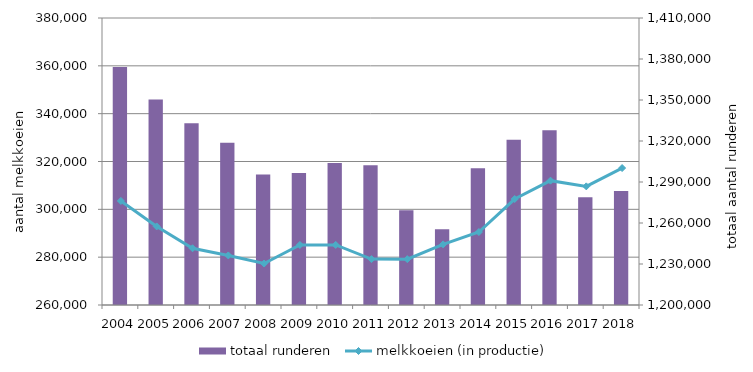
| Category | totaal runderen |
|---|---|
| 2004.0 | 1374090 |
| 2005.0 | 1350304 |
| 2006.0 | 1332923 |
| 2007.0 | 1318654 |
| 2008.0 | 1295449 |
| 2009.0 | 1296510 |
| 2010.0 | 1303865 |
| 2011.0 | 1302248 |
| 2012.0 | 1269405 |
| 2013.0 | 1255400 |
| 2014.0 | 1299984 |